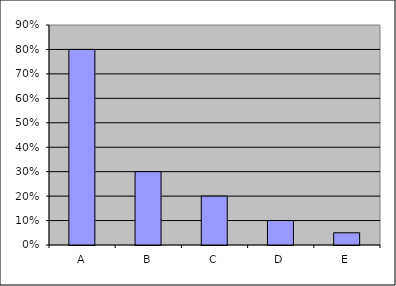
| Category | Series 0 |
|---|---|
| A | 0.8 |
| B | 0.3 |
| C | 0.2 |
| D | 0.1 |
| E | 0.05 |